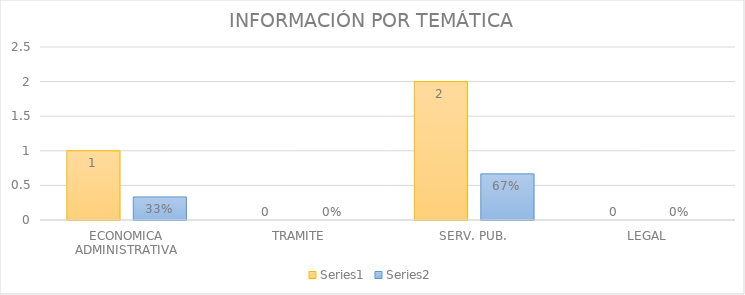
| Category | Series 3 | Series 4 |
|---|---|---|
| ECONOMICA ADMINISTRATIVA | 1 | 0.333 |
| TRAMITE | 0 | 0 |
| SERV. PUB. | 2 | 0.667 |
| LEGAL | 0 | 0 |